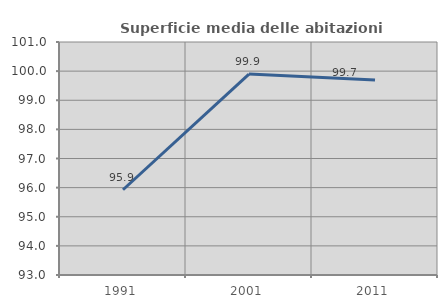
| Category | Superficie media delle abitazioni occupate |
|---|---|
| 1991.0 | 95.928 |
| 2001.0 | 99.899 |
| 2011.0 | 99.692 |